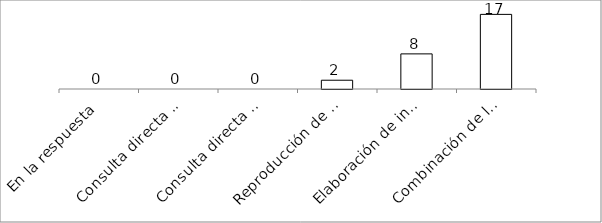
| Category | Series 0 |
|---|---|
| En la respuesta | 0 |
| Consulta directa personal | 0 |
| Consulta directa electrónica | 0 |
| Reproducción de documentos | 2 |
| Elaboración de informes | 8 |
| Combinación de las anteriores | 17 |